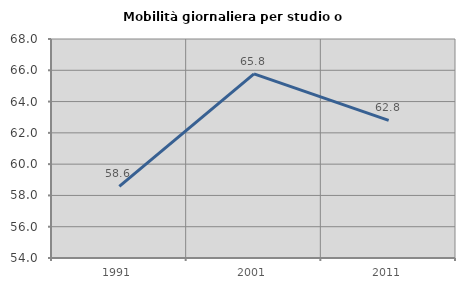
| Category | Mobilità giornaliera per studio o lavoro |
|---|---|
| 1991.0 | 58.575 |
| 2001.0 | 65.772 |
| 2011.0 | 62.8 |